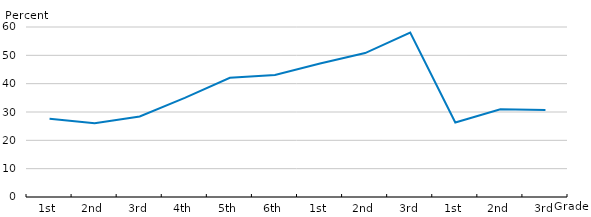
| Category | Series 0 |
|---|---|
| 1st | 27.6 |
| 2nd | 26 |
| 3rd | 28.4 |
| 4th | 35 |
| 5th | 42.1 |
| 6th | 43.1 |
| 1st | 47.1 |
| 2nd | 50.8 |
| 3rd | 58 |
| 1st | 26.3 |
| 2nd | 31 |
| 3rd | 30.7 |